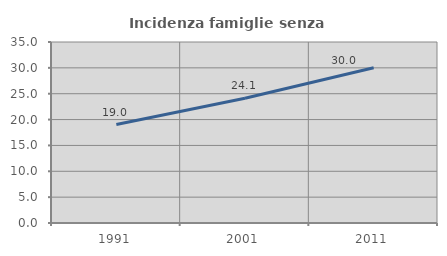
| Category | Incidenza famiglie senza nuclei |
|---|---|
| 1991.0 | 19.031 |
| 2001.0 | 24.13 |
| 2011.0 | 30.036 |